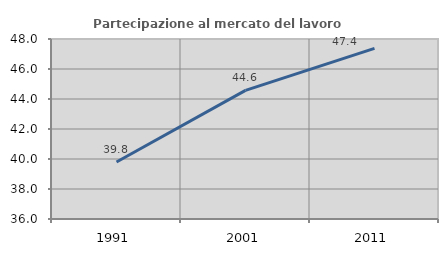
| Category | Partecipazione al mercato del lavoro  femminile |
|---|---|
| 1991.0 | 39.804 |
| 2001.0 | 44.576 |
| 2011.0 | 47.375 |